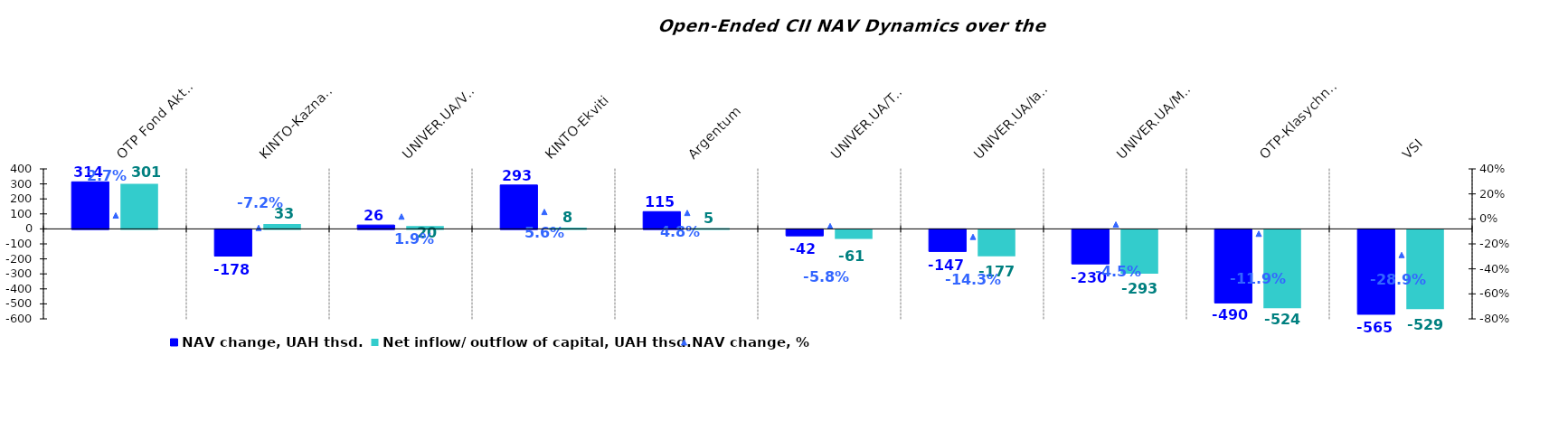
| Category | NAV change, UAH thsd. | Net inflow/ outflow of capital, UAH thsd. |
|---|---|---|
| ОТP Fond Aktsii | 313.916 | 300.691 |
| KINTO-Kaznacheiskyi | -178.061 | 32.505 |
| UNIVER.UA/Volodymyr Velykyi: Fond Zbalansovanyi | 25.704 | 19.615 |
| KINTO-Ekviti | 292.592 | 8.017 |
| Аrgentum | 115.107 | 4.782 |
| UNIVER.UA/Taras Shevchenko: Fond Zaoshchadzhen | -42.069 | -61.441 |
| UNIVER.UA/Iaroslav Mudryi: Fond Aktsii | -146.795 | -177.024 |
| UNIVER.UA/Myhailo Hrushevskyi: Fond Derzhavnykh Paperiv    | -230.077 | -292.532 |
| OTP-Кlasychnyi | -490.206 | -523.709 |
| VSI | -565.498 | -528.749 |